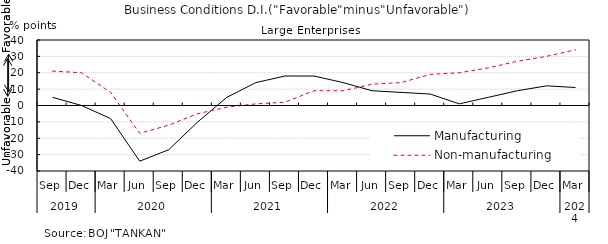
| Category | Manufacturing | Non-manufacturing |
|---|---|---|
| 0 | 5 | 21 |
| 1 | 0 | 20 |
| 2 | -8 | 8 |
| 3 | -34 | -17 |
| 4 | -27 | -12 |
| 5 | -10 | -5 |
| 6 | 5 | -1 |
| 7 | 14 | 1 |
| 8 | 18 | 2 |
| 9 | 18 | 9 |
| 10 | 14 | 9 |
| 11 | 9 | 13 |
| 12 | 8 | 14 |
| 13 | 7 | 19 |
| 14 | 1 | 20 |
| 15 | 5 | 23 |
| 16 | 9 | 27 |
| 17 | 12 | 30 |
| 18 | 11 | 34 |